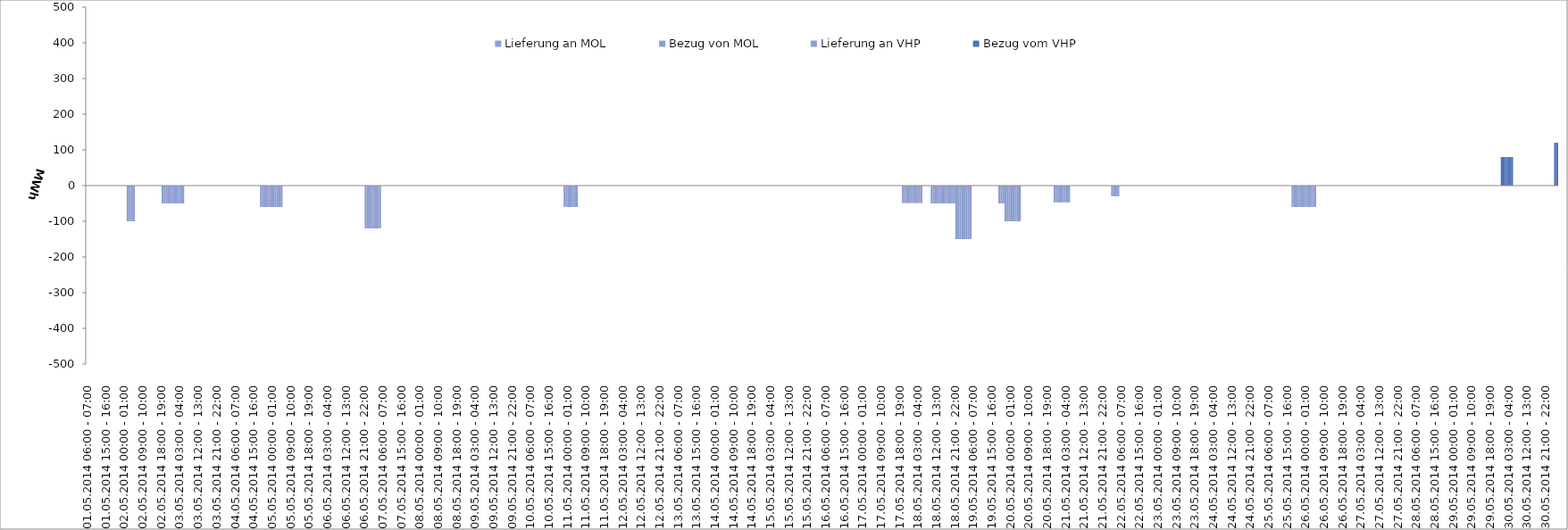
| Category | Bezug vom VHP | Lieferung an VHP | Bezug von MOL | Lieferung an MOL |
|---|---|---|---|---|
| 01.05.2014 06:00 - 07:00 | 0 | 0 | 0 | 0 |
| 01.05.2014 07:00 - 08:00 | 0 | 0 | 0 | 0 |
| 01.05.2014 08:00 - 09:00 | 0 | 0 | 0 | 0 |
| 01.05.2014 09:00 - 10:00 | 0 | 0 | 0 | 0 |
| 01.05.2014 10:00 - 11:00 | 0 | 0 | 0 | 0 |
| 01.05.2014 11:00 - 12:00 | 0 | 0 | 0 | 0 |
| 01.05.2014 12:00 - 13:00 | 0 | 0 | 0 | 0 |
| 01.05.2014 13:00 - 14:00 | 0 | 0 | 0 | 0 |
| 01.05.2014 14:00 - 15:00 | 0 | 0 | 0 | 0 |
| 01.05.2014 15:00 - 16:00 | 0 | 0 | 0 | 0 |
| 01.05.2014 16:00 - 17:00 | 0 | 0 | 0 | 0 |
| 01.05.2014 17:00 - 18:00 | 0 | 0 | 0 | 0 |
| 01.05.2014 18:00 - 19:00 | 0 | 0 | 0 | 0 |
| 01.05.2014 19:00 - 20:00 | 0 | 0 | 0 | 0 |
| 01.05.2014 20:00 - 21:00 | 0 | 0 | 0 | 0 |
| 01.05.2014 21:00 - 22:00 | 0 | 0 | 0 | 0 |
| 01.05.2014 22:00 - 23:00 | 0 | 0 | 0 | 0 |
| 01.05.2014 23:00 - 24:00 | 0 | 0 | 0 | 0 |
| 02.05.2014 00:00 - 01:00 | 0 | 0 | 0 | 0 |
| 02.05.2014 01:00 - 02:00 | 0 | 0 | 0 | 0 |
| 02.05.2014 02:00 - 03:00 | 0 | -100 | 0 | 0 |
| 02.05.2014 03:00 - 04:00 | 0 | -100 | 0 | 0 |
| 02.05.2014 04:00 - 05:00 | 0 | -100 | 0 | 0 |
| 02.05.2014 05:00 - 06:00 | 0 | -100 | 0 | 0 |
| 02.05.2014 06:00 - 07:00 | 0 | 0 | 0 | 0 |
| 02.05.2014 07:00 - 08:00 | 0 | 0 | 0 | 0 |
| 02.05.2014 08:00 - 09:00 | 0 | 0 | 0 | 0 |
| 02.05.2014 09:00 - 10:00 | 0 | 0 | 0 | 0 |
| 02.05.2014 10:00 - 11:00 | 0 | 0 | 0 | 0 |
| 02.05.2014 11:00 - 12:00 | 0 | 0 | 0 | 0 |
| 02.05.2014 12:00 - 13:00 | 0 | 0 | 0 | 0 |
| 02.05.2014 13:00 - 14:00 | 0 | 0 | 0 | 0 |
| 02.05.2014 14:00 - 15:00 | 0 | 0 | 0 | 0 |
| 02.05.2014 15:00 - 16:00 | 0 | 0 | 0 | 0 |
| 02.05.2014 16:00 - 17:00 | 0 | 0 | 0 | 0 |
| 02.05.2014 17:00 - 18:00 | 0 | 0 | 0 | 0 |
| 02.05.2014 18:00 - 19:00 | 0 | 0 | 0 | 0 |
| 02.05.2014 19:00 - 20:00 | 0 | -50 | 0 | 0 |
| 02.05.2014 20:00 - 21:00 | 0 | -50 | 0 | 0 |
| 02.05.2014 21:00 - 22:00 | 0 | -50 | 0 | 0 |
| 02.05.2014 22:00 - 23:00 | 0 | -50 | 0 | 0 |
| 02.05.2014 23:00 - 24:00 | 0 | -50 | 0 | 0 |
| 03.05.2014 00:00 - 01:00 | 0 | -50 | 0 | 0 |
| 03.05.2014 01:00 - 02:00 | 0 | -50 | 0 | 0 |
| 03.05.2014 02:00 - 03:00 | 0 | -50 | 0 | 0 |
| 03.05.2014 03:00 - 04:00 | 0 | -50 | 0 | 0 |
| 03.05.2014 04:00 - 05:00 | 0 | -50 | 0 | 0 |
| 03.05.2014 05:00 - 06:00 | 0 | -50 | 0 | 0 |
| 03.05.2014 06:00 - 07:00 | 0 | 0 | 0 | 0 |
| 03.05.2014 07:00 - 08:00 | 0 | 0 | 0 | 0 |
| 03.05.2014 08:00 - 09:00 | 0 | 0 | 0 | 0 |
| 03.05.2014 09:00 - 10:00 | 0 | 0 | 0 | 0 |
| 03.05.2014 10:00 - 11:00 | 0 | 0 | 0 | 0 |
| 03.05.2014 11:00 - 12:00 | 0 | 0 | 0 | 0 |
| 03.05.2014 12:00 - 13:00 | 0 | 0 | 0 | 0 |
| 03.05.2014 13:00 - 14:00 | 0 | 0 | 0 | 0 |
| 03.05.2014 14:00 - 15:00 | 0 | 0 | 0 | 0 |
| 03.05.2014 15:00 - 16:00 | 0 | 0 | 0 | 0 |
| 03.05.2014 16:00 - 17:00 | 0 | 0 | 0 | 0 |
| 03.05.2014 17:00 - 18:00 | 0 | 0 | 0 | 0 |
| 03.05.2014 18:00 - 19:00 | 0 | 0 | 0 | 0 |
| 03.05.2014 19:00 - 20:00 | 0 | 0 | 0 | 0 |
| 03.05.2014 20:00 - 21:00 | 0 | 0 | 0 | 0 |
| 03.05.2014 21:00 - 22:00 | 0 | 0 | 0 | 0 |
| 03.05.2014 22:00 - 23:00 | 0 | 0 | 0 | 0 |
| 03.05.2014 23:00 - 24:00 | 0 | 0 | 0 | 0 |
| 04.05.2014 00:00 - 01:00 | 0 | 0 | 0 | 0 |
| 04.05.2014 01:00 - 02:00 | 0 | 0 | 0 | 0 |
| 04.05.2014 02:00 - 03:00 | 0 | 0 | 0 | 0 |
| 04.05.2014 03:00 - 04:00 | 0 | 0 | 0 | 0 |
| 04.05.2014 04:00 - 05:00 | 0 | 0 | 0 | 0 |
| 04.05.2014 05:00 - 06:00 | 0 | 0 | 0 | 0 |
| 04.05.2014 06:00 - 07:00 | 0 | 0 | 0 | 0 |
| 04.05.2014 07:00 - 08:00 | 0 | 0 | 0 | 0 |
| 04.05.2014 08:00 - 09:00 | 0 | 0 | 0 | 0 |
| 04.05.2014 09:00 - 10:00 | 0 | 0 | 0 | 0 |
| 04.05.2014 10:00 - 11:00 | 0 | 0 | 0 | 0 |
| 04.05.2014 11:00 - 12:00 | 0 | 0 | 0 | 0 |
| 04.05.2014 12:00 - 13:00 | 0 | 0 | 0 | 0 |
| 04.05.2014 13:00 - 14:00 | 0 | 0 | 0 | 0 |
| 04.05.2014 14:00 - 15:00 | 0 | 0 | 0 | 0 |
| 04.05.2014 15:00 - 16:00 | 0 | 0 | 0 | 0 |
| 04.05.2014 16:00 - 17:00 | 0 | 0 | 0 | 0 |
| 04.05.2014 17:00 - 18:00 | 0 | 0 | 0 | 0 |
| 04.05.2014 18:00 - 19:00 | 0 | 0 | 0 | 0 |
| 04.05.2014 19:00 - 20:00 | 0 | -60 | 0 | 0 |
| 04.05.2014 20:00 - 21:00 | 0 | -60 | 0 | 0 |
| 04.05.2014 21:00 - 22:00 | 0 | -60 | 0 | 0 |
| 04.05.2014 22:00 - 23:00 | 0 | -60 | 0 | 0 |
| 04.05.2014 23:00 - 24:00 | 0 | -60 | 0 | 0 |
| 05.05.2014 00:00 - 01:00 | 0 | -60 | 0 | 0 |
| 05.05.2014 01:00 - 02:00 | 0 | -60 | 0 | 0 |
| 05.05.2014 02:00 - 03:00 | 0 | -60 | 0 | 0 |
| 05.05.2014 03:00 - 04:00 | 0 | -60 | 0 | 0 |
| 05.05.2014 04:00 - 05:00 | 0 | -60 | 0 | 0 |
| 05.05.2014 05:00 - 06:00 | 0 | -60 | 0 | 0 |
| 05.05.2014 06:00 - 07:00 | 0 | 0 | 0 | 0 |
| 05.05.2014 07:00 - 08:00 | 0 | 0 | 0 | 0 |
| 05.05.2014 08:00 - 09:00 | 0 | 0 | 0 | 0 |
| 05.05.2014 09:00 - 10:00 | 0 | 0 | 0 | 0 |
| 05.05.2014 10:00 - 11:00 | 0 | 0 | 0 | 0 |
| 05.05.2014 11:00 - 12:00 | 0 | 0 | 0 | 0 |
| 05.05.2014 12:00 - 13:00 | 0 | 0 | 0 | 0 |
| 05.05.2014 13:00 - 14:00 | 0 | 0 | 0 | 0 |
| 05.05.2014 14:00 - 15:00 | 0 | 0 | 0 | 0 |
| 05.05.2014 15:00 - 16:00 | 0 | 0 | 0 | 0 |
| 05.05.2014 16:00 - 17:00 | 0 | 0 | 0 | 0 |
| 05.05.2014 17:00 - 18:00 | 0 | 0 | 0 | 0 |
| 05.05.2014 18:00 - 19:00 | 0 | 0 | 0 | 0 |
| 05.05.2014 19:00 - 20:00 | 0 | 0 | 0 | 0 |
| 05.05.2014 20:00 - 21:00 | 0 | 0 | 0 | 0 |
| 05.05.2014 21:00 - 22:00 | 0 | 0 | 0 | 0 |
| 05.05.2014 22:00 - 23:00 | 0 | 0 | 0 | 0 |
| 05.05.2014 23:00 - 24:00 | 0 | 0 | 0 | 0 |
| 06.05.2014 00:00 - 01:00 | 0 | 0 | 0 | 0 |
| 06.05.2014 01:00 - 02:00 | 0 | 0 | 0 | 0 |
| 06.05.2014 02:00 - 03:00 | 0 | 0 | 0 | 0 |
| 06.05.2014 03:00 - 04:00 | 0 | 0 | 0 | 0 |
| 06.05.2014 04:00 - 05:00 | 0 | 0 | 0 | 0 |
| 06.05.2014 05:00 - 06:00 | 0 | 0 | 0 | 0 |
| 06.05.2014 06:00 - 07:00 | 0 | 0 | 0 | 0 |
| 06.05.2014 07:00 - 08:00 | 0 | 0 | 0 | 0 |
| 06.05.2014 08:00 - 09:00 | 0 | 0 | 0 | 0 |
| 06.05.2014 09:00 - 10:00 | 0 | 0 | 0 | 0 |
| 06.05.2014 10:00 - 11:00 | 0 | 0 | 0 | 0 |
| 06.05.2014 11:00 - 12:00 | 0 | 0 | 0 | 0 |
| 06.05.2014 12:00 - 13:00 | 0 | 0 | 0 | 0 |
| 06.05.2014 13:00 - 14:00 | 0 | 0 | 0 | 0 |
| 06.05.2014 14:00 - 15:00 | 0 | 0 | 0 | 0 |
| 06.05.2014 15:00 - 16:00 | 0 | 0 | 0 | 0 |
| 06.05.2014 16:00 - 17:00 | 0 | 0 | 0 | 0 |
| 06.05.2014 17:00 - 18:00 | 0 | 0 | 0 | 0 |
| 06.05.2014 18:00 - 19:00 | 0 | 0 | 0 | 0 |
| 06.05.2014 19:00 - 20:00 | 0 | 0 | 0 | 0 |
| 06.05.2014 20:00 - 21:00 | 0 | 0 | 0 | 0 |
| 06.05.2014 21:00 - 22:00 | 0 | 0 | 0 | 0 |
| 06.05.2014 22:00 - 23:00 | 0 | -120 | 0 | 0 |
| 06.05.2014 23:00 - 24:00 | 0 | -120 | 0 | 0 |
| 07.05.2014 00:00 - 01:00 | 0 | -120 | 0 | 0 |
| 07.05.2014 01:00 - 02:00 | 0 | -120 | 0 | 0 |
| 07.05.2014 02:00 - 03:00 | 0 | -120 | 0 | 0 |
| 07.05.2014 03:00 - 04:00 | 0 | -120 | 0 | 0 |
| 07.05.2014 04:00 - 05:00 | 0 | -120 | 0 | 0 |
| 07.05.2014 05:00 - 06:00 | 0 | -120 | 0 | 0 |
| 07.05.2014 06:00 - 07:00 | 0 | 0 | 0 | 0 |
| 07.05.2014 07:00 - 08:00 | 0 | 0 | 0 | 0 |
| 07.05.2014 08:00 - 09:00 | 0 | 0 | 0 | 0 |
| 07.05.2014 09:00 - 10:00 | 0 | 0 | 0 | 0 |
| 07.05.2014 10:00 - 11:00 | 0 | 0 | 0 | 0 |
| 07.05.2014 11:00 - 12:00 | 0 | 0 | 0 | 0 |
| 07.05.2014 12:00 - 13:00 | 0 | 0 | 0 | 0 |
| 07.05.2014 13:00 - 14:00 | 0 | 0 | 0 | 0 |
| 07.05.2014 14:00 - 15:00 | 0 | 0 | 0 | 0 |
| 07.05.2014 15:00 - 16:00 | 0 | 0 | 0 | 0 |
| 07.05.2014 16:00 - 17:00 | 0 | 0 | 0 | 0 |
| 07.05.2014 17:00 - 18:00 | 0 | 0 | 0 | 0 |
| 07.05.2014 18:00 - 19:00 | 0 | 0 | 0 | 0 |
| 07.05.2014 19:00 - 20:00 | 0 | 0 | 0 | 0 |
| 07.05.2014 20:00 - 21:00 | 0 | 0 | 0 | 0 |
| 07.05.2014 21:00 - 22:00 | 0 | 0 | 0 | 0 |
| 07.05.2014 22:00 - 23:00 | 0 | 0 | 0 | 0 |
| 07.05.2014 23:00 - 24:00 | 0 | 0 | 0 | 0 |
| 08.05.2014 00:00 - 01:00 | 0 | 0 | 0 | 0 |
| 08.05.2014 01:00 - 02:00 | 0 | 0 | 0 | 0 |
| 08.05.2014 02:00 - 03:00 | 0 | 0 | 0 | 0 |
| 08.05.2014 03:00 - 04:00 | 0 | 0 | 0 | 0 |
| 08.05.2014 04:00 - 05:00 | 0 | 0 | 0 | 0 |
| 08.05.2014 05:00 - 06:00 | 0 | 0 | 0 | 0 |
| 08.05.2014 06:00 - 07:00 | 0 | 0 | 0 | 0 |
| 08.05.2014 07:00 - 08:00 | 0 | 0 | 0 | 0 |
| 08.05.2014 08:00 - 09:00 | 0 | 0 | 0 | 0 |
| 08.05.2014 09:00 - 10:00 | 0 | 0 | 0 | 0 |
| 08.05.2014 10:00 - 11:00 | 0 | 0 | 0 | 0 |
| 08.05.2014 11:00 - 12:00 | 0 | 0 | 0 | 0 |
| 08.05.2014 12:00 - 13:00 | 0 | 0 | 0 | 0 |
| 08.05.2014 13:00 - 14:00 | 0 | 0 | 0 | 0 |
| 08.05.2014 14:00 - 15:00 | 0 | 0 | 0 | 0 |
| 08.05.2014 15:00 - 16:00 | 0 | 0 | 0 | 0 |
| 08.05.2014 16:00 - 17:00 | 0 | 0 | 0 | 0 |
| 08.05.2014 17:00 - 18:00 | 0 | 0 | 0 | 0 |
| 08.05.2014 18:00 - 19:00 | 0 | 0 | 0 | 0 |
| 08.05.2014 19:00 - 20:00 | 0 | 0 | 0 | 0 |
| 08.05.2014 20:00 - 21:00 | 0 | 0 | 0 | 0 |
| 08.05.2014 21:00 - 22:00 | 0 | 0 | 0 | 0 |
| 08.05.2014 22:00 - 23:00 | 0 | 0 | 0 | 0 |
| 08.05.2014 23:00 - 24:00 | 0 | 0 | 0 | 0 |
| 09.05.2014 00:00 - 01:00 | 0 | 0 | 0 | 0 |
| 09.05.2014 01:00 - 02:00 | 0 | 0 | 0 | 0 |
| 09.05.2014 02:00 - 03:00 | 0 | 0 | 0 | 0 |
| 09.05.2014 03:00 - 04:00 | 0 | 0 | 0 | 0 |
| 09.05.2014 04:00 - 05:00 | 0 | 0 | 0 | 0 |
| 09.05.2014 05:00 - 06:00 | 0 | 0 | 0 | 0 |
| 09.05.2014 06:00 - 07:00 | 0 | 0 | 0 | 0 |
| 09.05.2014 07:00 - 08:00 | 0 | 0 | 0 | 0 |
| 09.05.2014 08:00 - 09:00 | 0 | 0 | 0 | 0 |
| 09.05.2014 09:00 - 10:00 | 0 | 0 | 0 | 0 |
| 09.05.2014 10:00 - 11:00 | 0 | 0 | 0 | 0 |
| 09.05.2014 11:00 - 12:00 | 0 | 0 | 0 | 0 |
| 09.05.2014 12:00 - 13:00 | 0 | 0 | 0 | 0 |
| 09.05.2014 13:00 - 14:00 | 0 | 0 | 0 | 0 |
| 09.05.2014 14:00 - 15:00 | 0 | 0 | 0 | 0 |
| 09.05.2014 15:00 - 16:00 | 0 | 0 | 0 | 0 |
| 09.05.2014 16:00 - 17:00 | 0 | 0 | 0 | 0 |
| 09.05.2014 17:00 - 18:00 | 0 | 0 | 0 | 0 |
| 09.05.2014 18:00 - 19:00 | 0 | 0 | 0 | 0 |
| 09.05.2014 19:00 - 20:00 | 0 | 0 | 0 | 0 |
| 09.05.2014 20:00 - 21:00 | 0 | 0 | 0 | 0 |
| 09.05.2014 21:00 - 22:00 | 0 | 0 | 0 | 0 |
| 09.05.2014 22:00 - 23:00 | 0 | 0 | 0 | 0 |
| 09.05.2014 23:00 - 24:00 | 0 | 0 | 0 | 0 |
| 10.05.2014 00:00 - 01:00 | 0 | 0 | 0 | 0 |
| 10.05.2014 01:00 - 02:00 | 0 | 0 | 0 | 0 |
| 10.05.2014 02:00 - 03:00 | 0 | 0 | 0 | 0 |
| 10.05.2014 03:00 - 04:00 | 0 | 0 | 0 | 0 |
| 10.05.2014 04:00 - 05:00 | 0 | 0 | 0 | 0 |
| 10.05.2014 05:00 - 06:00 | 0 | 0 | 0 | 0 |
| 10.05.2014 06:00 - 07:00 | 0 | 0 | 0 | 0 |
| 10.05.2014 07:00 - 08:00 | 0 | 0 | 0 | 0 |
| 10.05.2014 08:00 - 09:00 | 0 | 0 | 0 | 0 |
| 10.05.2014 09:00 - 10:00 | 0 | 0 | 0 | 0 |
| 10.05.2014 10:00 - 11:00 | 0 | 0 | 0 | 0 |
| 10.05.2014 11:00 - 12:00 | 0 | 0 | 0 | 0 |
| 10.05.2014 12:00 - 13:00 | 0 | 0 | 0 | 0 |
| 10.05.2014 13:00 - 14:00 | 0 | 0 | 0 | 0 |
| 10.05.2014 14:00 - 15:00 | 0 | 0 | 0 | 0 |
| 10.05.2014 15:00 - 16:00 | 0 | 0 | 0 | 0 |
| 10.05.2014 16:00 - 17:00 | 0 | 0 | 0 | 0 |
| 10.05.2014 17:00 - 18:00 | 0 | 0 | 0 | 0 |
| 10.05.2014 18:00 - 19:00 | 0 | 0 | 0 | 0 |
| 10.05.2014 19:00 - 20:00 | 0 | 0 | 0 | 0 |
| 10.05.2014 20:00 - 21:00 | 0 | 0 | 0 | 0 |
| 10.05.2014 21:00 - 22:00 | 0 | 0 | 0 | 0 |
| 10.05.2014 22:00 - 23:00 | 0 | 0 | 0 | 0 |
| 10.05.2014 23:00 - 24:00 | 0 | -60 | 0 | 0 |
| 11.05.2014 00:00 - 01:00 | 0 | -60 | 0 | 0 |
| 11.05.2014 01:00 - 02:00 | 0 | -60 | 0 | 0 |
| 11.05.2014 02:00 - 03:00 | 0 | -60 | 0 | 0 |
| 11.05.2014 03:00 - 04:00 | 0 | -60 | 0 | 0 |
| 11.05.2014 04:00 - 05:00 | 0 | -60 | 0 | 0 |
| 11.05.2014 05:00 - 06:00 | 0 | -60 | 0 | 0 |
| 11.05.2014 06:00 - 07:00 | 0 | 0 | 0 | 0 |
| 11.05.2014 07:00 - 08:00 | 0 | 0 | 0 | 0 |
| 11.05.2014 08:00 - 09:00 | 0 | 0 | 0 | 0 |
| 11.05.2014 09:00 - 10:00 | 0 | 0 | 0 | 0 |
| 11.05.2014 10:00 - 11:00 | 0 | 0 | 0 | 0 |
| 11.05.2014 11:00 - 12:00 | 0 | 0 | 0 | 0 |
| 11.05.2014 12:00 - 13:00 | 0 | 0 | 0 | 0 |
| 11.05.2014 13:00 - 14:00 | 0 | 0 | 0 | 0 |
| 11.05.2014 14:00 - 15:00 | 0 | 0 | 0 | 0 |
| 11.05.2014 15:00 - 16:00 | 0 | 0 | 0 | 0 |
| 11.05.2014 16:00 - 17:00 | 0 | 0 | 0 | 0 |
| 11.05.2014 17:00 - 18:00 | 0 | 0 | 0 | 0 |
| 11.05.2014 18:00 - 19:00 | 0 | 0 | 0 | 0 |
| 11.05.2014 19:00 - 20:00 | 0 | 0 | 0 | 0 |
| 11.05.2014 20:00 - 21:00 | 0 | 0 | 0 | 0 |
| 11.05.2014 21:00 - 22:00 | 0 | 0 | 0 | 0 |
| 11.05.2014 22:00 - 23:00 | 0 | 0 | 0 | 0 |
| 11.05.2014 23:00 - 24:00 | 0 | 0 | 0 | 0 |
| 12.05.2014 00:00 - 01:00 | 0 | 0 | 0 | 0 |
| 12.05.2014 01:00 - 02:00 | 0 | 0 | 0 | 0 |
| 12.05.2014 02:00 - 03:00 | 0 | 0 | 0 | 0 |
| 12.05.2014 03:00 - 04:00 | 0 | 0 | 0 | 0 |
| 12.05.2014 04:00 - 05:00 | 0 | 0 | 0 | 0 |
| 12.05.2014 05:00 - 06:00 | 0 | 0 | 0 | 0 |
| 12.05.2014 06:00 - 07:00 | 0 | 0 | 0 | 0 |
| 12.05.2014 07:00 - 08:00 | 0 | 0 | 0 | 0 |
| 12.05.2014 08:00 - 09:00 | 0 | 0 | 0 | 0 |
| 12.05.2014 09:00 - 10:00 | 0 | 0 | 0 | 0 |
| 12.05.2014 10:00 - 11:00 | 0 | 0 | 0 | 0 |
| 12.05.2014 11:00 - 12:00 | 0 | 0 | 0 | 0 |
| 12.05.2014 12:00 - 13:00 | 0 | 0 | 0 | 0 |
| 12.05.2014 13:00 - 14:00 | 0 | 0 | 0 | 0 |
| 12.05.2014 14:00 - 15:00 | 0 | 0 | 0 | 0 |
| 12.05.2014 15:00 - 16:00 | 0 | 0 | 0 | 0 |
| 12.05.2014 16:00 - 17:00 | 0 | 0 | 0 | 0 |
| 12.05.2014 17:00 - 18:00 | 0 | 0 | 0 | 0 |
| 12.05.2014 18:00 - 19:00 | 0 | 0 | 0 | 0 |
| 12.05.2014 19:00 - 20:00 | 0 | 0 | 0 | 0 |
| 12.05.2014 20:00 - 21:00 | 0 | 0 | 0 | 0 |
| 12.05.2014 21:00 - 22:00 | 0 | 0 | 0 | 0 |
| 12.05.2014 22:00 - 23:00 | 0 | 0 | 0 | 0 |
| 12.05.2014 23:00 - 24:00 | 0 | 0 | 0 | 0 |
| 13.05.2014 00:00 - 01:00 | 0 | 0 | 0 | 0 |
| 13.05.2014 01:00 - 02:00 | 0 | 0 | 0 | 0 |
| 13.05.2014 02:00 - 03:00 | 0 | 0 | 0 | 0 |
| 13.05.2014 03:00 - 04:00 | 0 | 0 | 0 | 0 |
| 13.05.2014 04:00 - 05:00 | 0 | 0 | 0 | 0 |
| 13.05.2014 05:00 - 06:00 | 0 | 0 | 0 | 0 |
| 13.05.2014 06:00 - 07:00 | 0 | 0 | 0 | 0 |
| 13.05.2014 07:00 - 08:00 | 0 | 0 | 0 | 0 |
| 13.05.2014 08:00 - 09:00 | 0 | 0 | 0 | 0 |
| 13.05.2014 09:00 - 10:00 | 0 | 0 | 0 | 0 |
| 13.05.2014 10:00 - 11:00 | 0 | 0 | 0 | 0 |
| 13.05.2014 11:00 - 12:00 | 0 | 0 | 0 | 0 |
| 13.05.2014 12:00 - 13:00 | 0 | 0 | 0 | 0 |
| 13.05.2014 13:00 - 14:00 | 0 | 0 | 0 | 0 |
| 13.05.2014 14:00 - 15:00 | 0 | 0 | 0 | 0 |
| 13.05.2014 15:00 - 16:00 | 0 | 0 | 0 | 0 |
| 13.05.2014 16:00 - 17:00 | 0 | 0 | 0 | 0 |
| 13.05.2014 17:00 - 18:00 | 0 | 0 | 0 | 0 |
| 13.05.2014 18:00 - 19:00 | 0 | 0 | 0 | 0 |
| 13.05.2014 19:00 - 20:00 | 0 | 0 | 0 | 0 |
| 13.05.2014 20:00 - 21:00 | 0 | 0 | 0 | 0 |
| 13.05.2014 21:00 - 22:00 | 0 | 0 | 0 | 0 |
| 13.05.2014 22:00 - 23:00 | 0 | 0 | 0 | 0 |
| 13.05.2014 23:00 - 24:00 | 0 | 0 | 0 | 0 |
| 14.05.2014 00:00 - 01:00 | 0 | 0 | 0 | 0 |
| 14.05.2014 01:00 - 02:00 | 0 | 0 | 0 | 0 |
| 14.05.2014 02:00 - 03:00 | 0 | 0 | 0 | 0 |
| 14.05.2014 03:00 - 04:00 | 0 | 0 | 0 | 0 |
| 14.05.2014 04:00 - 05:00 | 0 | 0 | 0 | 0 |
| 14.05.2014 05:00 - 06:00 | 0 | 0 | 0 | 0 |
| 14.05.2014 06:00 - 07:00 | 0 | 0 | 0 | 0 |
| 14.05.2014 07:00 - 08:00 | 0 | 0 | 0 | 0 |
| 14.05.2014 08:00 - 09:00 | 0 | 0 | 0 | 0 |
| 14.05.2014 09:00 - 10:00 | 0 | 0 | 0 | 0 |
| 14.05.2014 10:00 - 11:00 | 0 | 0 | 0 | 0 |
| 14.05.2014 11:00 - 12:00 | 0 | 0 | 0 | 0 |
| 14.05.2014 12:00 - 13:00 | 0 | 0 | 0 | 0 |
| 14.05.2014 13:00 - 14:00 | 0 | 0 | 0 | 0 |
| 14.05.2014 14:00 - 15:00 | 0 | 0 | 0 | 0 |
| 14.05.2014 15:00 - 16:00 | 0 | 0 | 0 | 0 |
| 14.05.2014 16:00 - 17:00 | 0 | 0 | 0 | 0 |
| 14.05.2014 17:00 - 18:00 | 0 | 0 | 0 | 0 |
| 14.05.2014 18:00 - 19:00 | 0 | 0 | 0 | 0 |
| 14.05.2014 19:00 - 20:00 | 0 | 0 | 0 | 0 |
| 14.05.2014 20:00 - 21:00 | 0 | 0 | 0 | 0 |
| 14.05.2014 21:00 - 22:00 | 0 | 0 | 0 | 0 |
| 14.05.2014 22:00 - 23:00 | 0 | 0 | 0 | 0 |
| 14.05.2014 23:00 - 24:00 | 0 | 0 | 0 | 0 |
| 15.05.2014 00:00 - 01:00 | 0 | 0 | 0 | 0 |
| 15.05.2014 01:00 - 02:00 | 0 | 0 | 0 | 0 |
| 15.05.2014 02:00 - 03:00 | 0 | 0 | 0 | 0 |
| 15.05.2014 03:00 - 04:00 | 0 | 0 | 0 | 0 |
| 15.05.2014 04:00 - 05:00 | 0 | 0 | 0 | 0 |
| 15.05.2014 05:00 - 06:00 | 0 | 0 | 0 | 0 |
| 15.05.2014 06:00 - 07:00 | 0 | 0 | 0 | 0 |
| 15.05.2014 07:00 - 08:00 | 0 | 0 | 0 | 0 |
| 15.05.2014 08:00 - 09:00 | 0 | 0 | 0 | 0 |
| 15.05.2014 09:00 - 10:00 | 0 | 0 | 0 | 0 |
| 15.05.2014 10:00 - 11:00 | 0 | 0 | 0 | 0 |
| 15.05.2014 11:00 - 12:00 | 0 | 0 | 0 | 0 |
| 15.05.2014 12:00 - 13:00 | 0 | 0 | 0 | 0 |
| 15.05.2014 13:00 - 14:00 | 0 | 0 | 0 | 0 |
| 15.05.2014 14:00 - 15:00 | 0 | 0 | 0 | 0 |
| 15.05.2014 15:00 - 16:00 | 0 | 0 | 0 | 0 |
| 15.05.2014 16:00 - 17:00 | 0 | 0 | 0 | 0 |
| 15.05.2014 17:00 - 18:00 | 0 | 0 | 0 | 0 |
| 15.05.2014 18:00 - 19:00 | 0 | 0 | 0 | 0 |
| 15.05.2014 19:00 - 20:00 | 0 | 0 | 0 | 0 |
| 15.05.2014 20:00 - 21:00 | 0 | 0 | 0 | 0 |
| 15.05.2014 21:00 - 22:00 | 0 | 0 | 0 | 0 |
| 15.05.2014 22:00 - 23:00 | 0 | 0 | 0 | 0 |
| 15.05.2014 23:00 - 24:00 | 0 | 0 | 0 | 0 |
| 16.05.2014 00:00 - 01:00 | 0 | 0 | 0 | 0 |
| 16.05.2014 01:00 - 02:00 | 0 | 0 | 0 | 0 |
| 16.05.2014 02:00 - 03:00 | 0 | 0 | 0 | 0 |
| 16.05.2014 03:00 - 04:00 | 0 | 0 | 0 | 0 |
| 16.05.2014 04:00 - 05:00 | 0 | 0 | 0 | 0 |
| 16.05.2014 05:00 - 06:00 | 0 | 0 | 0 | 0 |
| 16.05.2014 06:00 - 07:00 | 0 | 0 | 0 | 0 |
| 16.05.2014 07:00 - 08:00 | 0 | 0 | 0 | 0 |
| 16.05.2014 08:00 - 09:00 | 0 | 0 | 0 | 0 |
| 16.05.2014 09:00 - 10:00 | 0 | 0 | 0 | 0 |
| 16.05.2014 10:00 - 11:00 | 0 | 0 | 0 | 0 |
| 16.05.2014 11:00 - 12:00 | 0 | 0 | 0 | 0 |
| 16.05.2014 12:00 - 13:00 | 0 | 0 | 0 | 0 |
| 16.05.2014 13:00 - 14:00 | 0 | 0 | 0 | 0 |
| 16.05.2014 14:00 - 15:00 | 0 | 0 | 0 | 0 |
| 16.05.2014 15:00 - 16:00 | 0 | 0 | 0 | 0 |
| 16.05.2014 16:00 - 17:00 | 0 | 0 | 0 | 0 |
| 16.05.2014 17:00 - 18:00 | 0 | 0 | 0 | 0 |
| 16.05.2014 18:00 - 19:00 | 0 | 0 | 0 | 0 |
| 16.05.2014 19:00 - 20:00 | 0 | 0 | 0 | 0 |
| 16.05.2014 20:00 - 21:00 | 0 | 0 | 0 | 0 |
| 16.05.2014 21:00 - 22:00 | 0 | 0 | 0 | 0 |
| 16.05.2014 22:00 - 23:00 | 0 | 0 | 0 | 0 |
| 16.05.2014 23:00 - 24:00 | 0 | 0 | 0 | 0 |
| 17.05.2014 00:00 - 01:00 | 0 | 0 | 0 | 0 |
| 17.05.2014 01:00 - 02:00 | 0 | 0 | 0 | 0 |
| 17.05.2014 02:00 - 03:00 | 0 | 0 | 0 | 0 |
| 17.05.2014 03:00 - 04:00 | 0 | 0 | 0 | 0 |
| 17.05.2014 04:00 - 05:00 | 0 | 0 | 0 | 0 |
| 17.05.2014 05:00 - 06:00 | 0 | 0 | 0 | 0 |
| 17.05.2014 06:00 - 07:00 | 0 | 0 | 0 | 0 |
| 17.05.2014 07:00 - 08:00 | 0 | 0 | 0 | 0 |
| 17.05.2014 08:00 - 09:00 | 0 | 0 | 0 | 0 |
| 17.05.2014 09:00 - 10:00 | 0 | 0 | 0 | 0 |
| 17.05.2014 10:00 - 11:00 | 0 | 0 | 0 | 0 |
| 17.05.2014 11:00 - 12:00 | 0 | 0 | 0 | 0 |
| 17.05.2014 12:00 - 13:00 | 0 | 0 | 0 | 0 |
| 17.05.2014 13:00 - 14:00 | 0 | 0 | 0 | 0 |
| 17.05.2014 14:00 - 15:00 | 0 | 0 | 0 | 0 |
| 17.05.2014 15:00 - 16:00 | 0 | 0 | 0 | 0 |
| 17.05.2014 16:00 - 17:00 | 0 | 0 | 0 | 0 |
| 17.05.2014 17:00 - 18:00 | 0 | 0 | 0 | 0 |
| 17.05.2014 18:00 - 19:00 | 0 | 0 | 0 | 0 |
| 17.05.2014 19:00 - 20:00 | 0 | 0 | 0 | 0 |
| 17.05.2014 20:00 - 21:00 | 0 | -49 | 0 | 0 |
| 17.05.2014 21:00 - 22:00 | 0 | -49 | 0 | 0 |
| 17.05.2014 22:00 - 23:00 | 0 | -49 | 0 | 0 |
| 17.05.2014 23:00 - 24:00 | 0 | -49 | 0 | 0 |
| 18.05.2014 00:00 - 01:00 | 0 | -49 | 0 | 0 |
| 18.05.2014 01:00 - 02:00 | 0 | -49 | 0 | 0 |
| 18.05.2014 02:00 - 03:00 | 0 | -49 | 0 | 0 |
| 18.05.2014 03:00 - 04:00 | 0 | -49 | 0 | 0 |
| 18.05.2014 04:00 - 05:00 | 0 | -49 | 0 | 0 |
| 18.05.2014 05:00 - 06:00 | 0 | -49 | 0 | 0 |
| 18.05.2014 06:00 - 07:00 | 0 | 0 | 0 | 0 |
| 18.05.2014 07:00 - 08:00 | 0 | 0 | 0 | 0 |
| 18.05.2014 08:00 - 09:00 | 0 | 0 | 0 | 0 |
| 18.05.2014 09:00 - 10:00 | 0 | 0 | 0 | 0 |
| 18.05.2014 10:00 - 11:00 | 0 | -50 | 0 | 0 |
| 18.05.2014 11:00 - 12:00 | 0 | -50 | 0 | 0 |
| 18.05.2014 12:00 - 13:00 | 0 | -50 | 0 | 0 |
| 18.05.2014 13:00 - 14:00 | 0 | -50 | 0 | 0 |
| 18.05.2014 14:00 - 15:00 | 0 | -50 | 0 | 0 |
| 18.05.2014 15:00 - 16:00 | 0 | -50 | 0 | 0 |
| 18.05.2014 16:00 - 17:00 | 0 | -50 | 0 | 0 |
| 18.05.2014 17:00 - 18:00 | 0 | -50 | 0 | 0 |
| 18.05.2014 18:00 - 19:00 | 0 | -50 | 0 | 0 |
| 18.05.2014 19:00 - 20:00 | 0 | -50 | 0 | 0 |
| 18.05.2014 20:00 - 21:00 | 0 | -50 | 0 | 0 |
| 18.05.2014 21:00 - 22:00 | 0 | -50 | 0 | 0 |
| 18.05.2014 22:00 - 23:00 | 0 | -150 | 0 | 0 |
| 18.05.2014 23:00 - 24:00 | 0 | -150 | 0 | 0 |
| 19.05.2014 00:00 - 01:00 | 0 | -150 | 0 | 0 |
| 19.05.2014 01:00 - 02:00 | 0 | -150 | 0 | 0 |
| 19.05.2014 02:00 - 03:00 | 0 | -150 | 0 | 0 |
| 19.05.2014 03:00 - 04:00 | 0 | -150 | 0 | 0 |
| 19.05.2014 04:00 - 05:00 | 0 | -150 | 0 | 0 |
| 19.05.2014 05:00 - 06:00 | 0 | -150 | 0 | 0 |
| 19.05.2014 06:00 - 07:00 | 0 | 0 | 0 | 0 |
| 19.05.2014 07:00 - 08:00 | 0 | 0 | 0 | 0 |
| 19.05.2014 08:00 - 09:00 | 0 | 0 | 0 | 0 |
| 19.05.2014 09:00 - 10:00 | 0 | 0 | 0 | 0 |
| 19.05.2014 10:00 - 11:00 | 0 | 0 | 0 | 0 |
| 19.05.2014 11:00 - 12:00 | 0 | 0 | 0 | 0 |
| 19.05.2014 12:00 - 13:00 | 0 | 0 | 0 | 0 |
| 19.05.2014 13:00 - 14:00 | 0 | 0 | 0 | 0 |
| 19.05.2014 14:00 - 15:00 | 0 | 0 | 0 | 0 |
| 19.05.2014 15:00 - 16:00 | 0 | 0 | 0 | 0 |
| 19.05.2014 16:00 - 17:00 | 0 | 0 | 0 | 0 |
| 19.05.2014 17:00 - 18:00 | 0 | 0 | 0 | 0 |
| 19.05.2014 18:00 - 19:00 | 0 | 0 | 0 | 0 |
| 19.05.2014 19:00 - 20:00 | 0 | -50 | 0 | 0 |
| 19.05.2014 20:00 - 21:00 | 0 | -50 | 0 | 0 |
| 19.05.2014 21:00 - 22:00 | 0 | -50 | 0 | 0 |
| 19.05.2014 22:00 - 23:00 | 0 | -100 | 0 | 0 |
| 19.05.2014 23:00 - 24:00 | 0 | -100 | 0 | 0 |
| 20.05.2014 00:00 - 01:00 | 0 | -100 | 0 | 0 |
| 20.05.2014 01:00 - 02:00 | 0 | -100 | 0 | 0 |
| 20.05.2014 02:00 - 03:00 | 0 | -100 | 0 | 0 |
| 20.05.2014 03:00 - 04:00 | 0 | -100 | 0 | 0 |
| 20.05.2014 04:00 - 05:00 | 0 | -100 | 0 | 0 |
| 20.05.2014 05:00 - 06:00 | 0 | -100 | 0 | 0 |
| 20.05.2014 06:00 - 07:00 | 0 | 0 | 0 | 0 |
| 20.05.2014 07:00 - 08:00 | 0 | 0 | 0 | 0 |
| 20.05.2014 08:00 - 09:00 | 0 | 0 | 0 | 0 |
| 20.05.2014 09:00 - 10:00 | 0 | 0 | 0 | 0 |
| 20.05.2014 10:00 - 11:00 | 0 | 0 | 0 | 0 |
| 20.05.2014 11:00 - 12:00 | 0 | 0 | 0 | 0 |
| 20.05.2014 12:00 - 13:00 | 0 | 0 | 0 | 0 |
| 20.05.2014 13:00 - 14:00 | 0 | 0 | 0 | 0 |
| 20.05.2014 14:00 - 15:00 | 0 | 0 | 0 | 0 |
| 20.05.2014 15:00 - 16:00 | 0 | 0 | 0 | 0 |
| 20.05.2014 16:00 - 17:00 | 0 | 0 | 0 | 0 |
| 20.05.2014 17:00 - 18:00 | 0 | 0 | 0 | 0 |
| 20.05.2014 18:00 - 19:00 | 0 | 0 | 0 | 0 |
| 20.05.2014 19:00 - 20:00 | 0 | 0 | 0 | 0 |
| 20.05.2014 20:00 - 21:00 | 0 | 0 | 0 | 0 |
| 20.05.2014 21:00 - 22:00 | 0 | 0 | 0 | 0 |
| 20.05.2014 22:00 - 23:00 | 0 | -47 | 0 | 0 |
| 20.05.2014 23:00 - 24:00 | 0 | -47 | 0 | 0 |
| 21.05.2014 00:00 - 01:00 | 0 | -47 | 0 | 0 |
| 21.05.2014 01:00 - 02:00 | 0 | -47 | 0 | 0 |
| 21.05.2014 02:00 - 03:00 | 0 | -47 | 0 | 0 |
| 21.05.2014 03:00 - 04:00 | 0 | -47 | 0 | 0 |
| 21.05.2014 04:00 - 05:00 | 0 | -47 | 0 | 0 |
| 21.05.2014 05:00 - 06:00 | 0 | -47 | 0 | 0 |
| 21.05.2014 06:00 - 07:00 | 0 | 0 | 0 | 0 |
| 21.05.2014 07:00 - 08:00 | 0 | 0 | 0 | 0 |
| 21.05.2014 08:00 - 09:00 | 0 | 0 | 0 | 0 |
| 21.05.2014 09:00 - 10:00 | 0 | 0 | 0 | 0 |
| 21.05.2014 10:00 - 11:00 | 0 | 0 | 0 | 0 |
| 21.05.2014 11:00 - 12:00 | 0 | 0 | 0 | 0 |
| 21.05.2014 12:00 - 13:00 | 0 | 0 | 0 | 0 |
| 21.05.2014 13:00 - 14:00 | 0 | 0 | 0 | 0 |
| 21.05.2014 14:00 - 15:00 | 0 | 0 | 0 | 0 |
| 21.05.2014 15:00 - 16:00 | 0 | 0 | 0 | 0 |
| 21.05.2014 16:00 - 17:00 | 0 | 0 | 0 | 0 |
| 21.05.2014 17:00 - 18:00 | 0 | 0 | 0 | 0 |
| 21.05.2014 18:00 - 19:00 | 0 | 0 | 0 | 0 |
| 21.05.2014 19:00 - 20:00 | 0 | 0 | 0 | 0 |
| 21.05.2014 20:00 - 21:00 | 0 | 0 | 0 | 0 |
| 21.05.2014 21:00 - 22:00 | 0 | 0 | 0 | 0 |
| 21.05.2014 22:00 - 23:00 | 0 | 0 | 0 | 0 |
| 21.05.2014 23:00 - 24:00 | 0 | 0 | 0 | 0 |
| 22.05.2014 00:00 - 01:00 | 0 | 0 | 0 | 0 |
| 22.05.2014 01:00 - 02:00 | 0 | 0 | 0 | 0 |
| 22.05.2014 02:00 - 03:00 | 0 | -30 | 0 | 0 |
| 22.05.2014 03:00 - 04:00 | 0 | -30 | 0 | 0 |
| 22.05.2014 04:00 - 05:00 | 0 | -30 | 0 | 0 |
| 22.05.2014 05:00 - 06:00 | 0 | -30 | 0 | 0 |
| 22.05.2014 06:00 - 07:00 | 0 | 0 | 0 | 0 |
| 22.05.2014 07:00 - 08:00 | 0 | 0 | 0 | 0 |
| 22.05.2014 08:00 - 09:00 | 0 | 0 | 0 | 0 |
| 22.05.2014 09:00 - 10:00 | 0 | 0 | 0 | 0 |
| 22.05.2014 10:00 - 11:00 | 0 | 0 | 0 | 0 |
| 22.05.2014 11:00 - 12:00 | 0 | 0 | 0 | 0 |
| 22.05.2014 12:00 - 13:00 | 0 | 0 | 0 | 0 |
| 22.05.2014 13:00 - 14:00 | 0 | 0 | 0 | 0 |
| 22.05.2014 14:00 - 15:00 | 0 | 0 | 0 | 0 |
| 22.05.2014 15:00 - 16:00 | 0 | 0 | 0 | 0 |
| 22.05.2014 16:00 - 17:00 | 0 | 0 | 0 | 0 |
| 22.05.2014 17:00 - 18:00 | 0 | 0 | 0 | 0 |
| 22.05.2014 18:00 - 19:00 | 0 | 0 | 0 | 0 |
| 22.05.2014 19:00 - 20:00 | 0 | 0 | 0 | 0 |
| 22.05.2014 20:00 - 21:00 | 0 | 0 | 0 | 0 |
| 22.05.2014 21:00 - 22:00 | 0 | 0 | 0 | 0 |
| 22.05.2014 22:00 - 23:00 | 0 | 0 | 0 | 0 |
| 22.05.2014 23:00 - 24:00 | 0 | 0 | 0 | 0 |
| 23.05.2014 00:00 - 01:00 | 0 | 0 | 0 | 0 |
| 23.05.2014 01:00 - 02:00 | 0 | 0 | 0 | 0 |
| 23.05.2014 02:00 - 03:00 | 0 | 0 | 0 | 0 |
| 23.05.2014 03:00 - 04:00 | 0 | 0 | 0 | 0 |
| 23.05.2014 04:00 - 05:00 | 0 | 0 | 0 | 0 |
| 23.05.2014 05:00 - 06:00 | 0 | 0 | 0 | 0 |
| 23.05.2014 06:00 - 07:00 | 0 | 0 | 0 | 0 |
| 23.05.2014 07:00 - 08:00 | 0 | 0 | 0 | 0 |
| 23.05.2014 08:00 - 09:00 | 0 | 0 | 0 | 0 |
| 23.05.2014 09:00 - 10:00 | 0 | 0 | 0 | 0 |
| 23.05.2014 10:00 - 11:00 | 0 | 0 | 0 | 0 |
| 23.05.2014 11:00 - 12:00 | 0 | 0 | 0 | 0 |
| 23.05.2014 12:00 - 13:00 | 0 | 0 | 0 | 0 |
| 23.05.2014 13:00 - 14:00 | 0 | 0 | 0 | 0 |
| 23.05.2014 14:00 - 15:00 | 0 | 0 | 0 | 0 |
| 23.05.2014 15:00 - 16:00 | 0 | 0 | 0 | 0 |
| 23.05.2014 16:00 - 17:00 | 0 | 0 | 0 | 0 |
| 23.05.2014 17:00 - 18:00 | 0 | 0 | 0 | 0 |
| 23.05.2014 18:00 - 19:00 | 0 | 0 | 0 | 0 |
| 23.05.2014 19:00 - 20:00 | 0 | 0 | 0 | 0 |
| 23.05.2014 20:00 - 21:00 | 0 | 0 | 0 | 0 |
| 23.05.2014 21:00 - 22:00 | 0 | 0 | 0 | 0 |
| 23.05.2014 22:00 - 23:00 | 0 | 0 | 0 | 0 |
| 23.05.2014 23:00 - 24:00 | 0 | 0 | 0 | 0 |
| 24.05.2014 00:00 - 01:00 | 0 | 0 | 0 | 0 |
| 24.05.2014 01:00 - 02:00 | 0 | 0 | 0 | 0 |
| 24.05.2014 02:00 - 03:00 | 0 | 0 | 0 | 0 |
| 24.05.2014 03:00 - 04:00 | 0 | 0 | 0 | 0 |
| 24.05.2014 04:00 - 05:00 | 0 | 0 | 0 | 0 |
| 24.05.2014 05:00 - 06:00 | 0 | 0 | 0 | 0 |
| 24.05.2014 06:00 - 07:00 | 0 | 0 | 0 | 0 |
| 24.05.2014 07:00 - 08:00 | 0 | 0 | 0 | 0 |
| 24.05.2014 08:00 - 09:00 | 0 | 0 | 0 | 0 |
| 24.05.2014 09:00 - 10:00 | 0 | 0 | 0 | 0 |
| 24.05.2014 10:00 - 11:00 | 0 | 0 | 0 | 0 |
| 24.05.2014 11:00 - 12:00 | 0 | 0 | 0 | 0 |
| 24.05.2014 12:00 - 13:00 | 0 | 0 | 0 | 0 |
| 24.05.2014 13:00 - 14:00 | 0 | 0 | 0 | 0 |
| 24.05.2014 14:00 - 15:00 | 0 | 0 | 0 | 0 |
| 24.05.2014 15:00 - 16:00 | 0 | 0 | 0 | 0 |
| 24.05.2014 16:00 - 17:00 | 0 | 0 | 0 | 0 |
| 24.05.2014 17:00 - 18:00 | 0 | 0 | 0 | 0 |
| 24.05.2014 18:00 - 19:00 | 0 | 0 | 0 | 0 |
| 24.05.2014 19:00 - 20:00 | 0 | 0 | 0 | 0 |
| 24.05.2014 20:00 - 21:00 | 0 | 0 | 0 | 0 |
| 24.05.2014 21:00 - 22:00 | 0 | 0 | 0 | 0 |
| 24.05.2014 22:00 - 23:00 | 0 | 0 | 0 | 0 |
| 24.05.2014 23:00 - 24:00 | 0 | 0 | 0 | 0 |
| 25.05.2014 00:00 - 01:00 | 0 | 0 | 0 | 0 |
| 25.05.2014 01:00 - 02:00 | 0 | 0 | 0 | 0 |
| 25.05.2014 02:00 - 03:00 | 0 | 0 | 0 | 0 |
| 25.05.2014 03:00 - 04:00 | 0 | 0 | 0 | 0 |
| 25.05.2014 04:00 - 05:00 | 0 | 0 | 0 | 0 |
| 25.05.2014 05:00 - 06:00 | 0 | 0 | 0 | 0 |
| 25.05.2014 06:00 - 07:00 | 0 | 0 | 0 | 0 |
| 25.05.2014 07:00 - 08:00 | 0 | 0 | 0 | 0 |
| 25.05.2014 08:00 - 09:00 | 0 | 0 | 0 | 0 |
| 25.05.2014 09:00 - 10:00 | 0 | 0 | 0 | 0 |
| 25.05.2014 10:00 - 11:00 | 0 | 0 | 0 | 0 |
| 25.05.2014 11:00 - 12:00 | 0 | 0 | 0 | 0 |
| 25.05.2014 12:00 - 13:00 | 0 | 0 | 0 | 0 |
| 25.05.2014 13:00 - 14:00 | 0 | 0 | 0 | 0 |
| 25.05.2014 14:00 - 15:00 | 0 | 0 | 0 | 0 |
| 25.05.2014 15:00 - 16:00 | 0 | 0 | 0 | 0 |
| 25.05.2014 16:00 - 17:00 | 0 | 0 | 0 | 0 |
| 25.05.2014 17:00 - 18:00 | 0 | 0 | 0 | 0 |
| 25.05.2014 18:00 - 19:00 | 0 | -60 | 0 | 0 |
| 25.05.2014 19:00 - 20:00 | 0 | -60 | 0 | 0 |
| 25.05.2014 20:00 - 21:00 | 0 | -60 | 0 | 0 |
| 25.05.2014 21:00 - 22:00 | 0 | -60 | 0 | 0 |
| 25.05.2014 22:00 - 23:00 | 0 | -60 | 0 | 0 |
| 25.05.2014 23:00 - 24:00 | 0 | -60 | 0 | 0 |
| 26.05.2014 00:00 - 01:00 | 0 | -60 | 0 | 0 |
| 26.05.2014 01:00 - 02:00 | 0 | -60 | 0 | 0 |
| 26.05.2014 02:00 - 03:00 | 0 | -60 | 0 | 0 |
| 26.05.2014 03:00 - 04:00 | 0 | -60 | 0 | 0 |
| 26.05.2014 04:00 - 05:00 | 0 | -60 | 0 | 0 |
| 26.05.2014 05:00 - 06:00 | 0 | -60 | 0 | 0 |
| 26.05.2014 06:00 - 07:00 | 0 | 0 | 0 | 0 |
| 26.05.2014 07:00 - 08:00 | 0 | 0 | 0 | 0 |
| 26.05.2014 08:00 - 09:00 | 0 | 0 | 0 | 0 |
| 26.05.2014 09:00 - 10:00 | 0 | 0 | 0 | 0 |
| 26.05.2014 10:00 - 11:00 | 0 | 0 | 0 | 0 |
| 26.05.2014 11:00 - 12:00 | 0 | 0 | 0 | 0 |
| 26.05.2014 12:00 - 13:00 | 0 | 0 | 0 | 0 |
| 26.05.2014 13:00 - 14:00 | 0 | 0 | 0 | 0 |
| 26.05.2014 14:00 - 15:00 | 0 | 0 | 0 | 0 |
| 26.05.2014 15:00 - 16:00 | 0 | 0 | 0 | 0 |
| 26.05.2014 16:00 - 17:00 | 0 | 0 | 0 | 0 |
| 26.05.2014 17:00 - 18:00 | 0 | 0 | 0 | 0 |
| 26.05.2014 18:00 - 19:00 | 0 | 0 | 0 | 0 |
| 26.05.2014 19:00 - 20:00 | 0 | 0 | 0 | 0 |
| 26.05.2014 20:00 - 21:00 | 0 | 0 | 0 | 0 |
| 26.05.2014 21:00 - 22:00 | 0 | 0 | 0 | 0 |
| 26.05.2014 22:00 - 23:00 | 0 | 0 | 0 | 0 |
| 26.05.2014 23:00 - 24:00 | 0 | 0 | 0 | 0 |
| 27.05.2014 00:00 - 01:00 | 0 | 0 | 0 | 0 |
| 27.05.2014 01:00 - 02:00 | 0 | 0 | 0 | 0 |
| 27.05.2014 02:00 - 03:00 | 0 | 0 | 0 | 0 |
| 27.05.2014 03:00 - 04:00 | 0 | 0 | 0 | 0 |
| 27.05.2014 04:00 - 05:00 | 0 | 0 | 0 | 0 |
| 27.05.2014 05:00 - 06:00 | 0 | 0 | 0 | 0 |
| 27.05.2014 06:00 - 07:00 | 0 | 0 | 0 | 0 |
| 27.05.2014 07:00 - 08:00 | 0 | 0 | 0 | 0 |
| 27.05.2014 08:00 - 09:00 | 0 | 0 | 0 | 0 |
| 27.05.2014 09:00 - 10:00 | 0 | 0 | 0 | 0 |
| 27.05.2014 10:00 - 11:00 | 0 | 0 | 0 | 0 |
| 27.05.2014 11:00 - 12:00 | 0 | 0 | 0 | 0 |
| 27.05.2014 12:00 - 13:00 | 0 | 0 | 0 | 0 |
| 27.05.2014 13:00 - 14:00 | 0 | 0 | 0 | 0 |
| 27.05.2014 14:00 - 15:00 | 0 | 0 | 0 | 0 |
| 27.05.2014 15:00 - 16:00 | 0 | 0 | 0 | 0 |
| 27.05.2014 16:00 - 17:00 | 0 | 0 | 0 | 0 |
| 27.05.2014 17:00 - 18:00 | 0 | 0 | 0 | 0 |
| 27.05.2014 18:00 - 19:00 | 0 | 0 | 0 | 0 |
| 27.05.2014 19:00 - 20:00 | 0 | 0 | 0 | 0 |
| 27.05.2014 20:00 - 21:00 | 0 | 0 | 0 | 0 |
| 27.05.2014 21:00 - 22:00 | 0 | 0 | 0 | 0 |
| 27.05.2014 22:00 - 23:00 | 0 | 0 | 0 | 0 |
| 27.05.2014 23:00 - 24:00 | 0 | 0 | 0 | 0 |
| 28.05.2014 00:00 - 01:00 | 0 | 0 | 0 | 0 |
| 28.05.2014 01:00 - 02:00 | 0 | 0 | 0 | 0 |
| 28.05.2014 02:00 - 03:00 | 0 | 0 | 0 | 0 |
| 28.05.2014 03:00 - 04:00 | 0 | 0 | 0 | 0 |
| 28.05.2014 04:00 - 05:00 | 0 | 0 | 0 | 0 |
| 28.05.2014 05:00 - 06:00 | 0 | 0 | 0 | 0 |
| 28.05.2014 06:00 - 07:00 | 0 | 0 | 0 | 0 |
| 28.05.2014 07:00 - 08:00 | 0 | 0 | 0 | 0 |
| 28.05.2014 08:00 - 09:00 | 0 | 0 | 0 | 0 |
| 28.05.2014 09:00 - 10:00 | 0 | 0 | 0 | 0 |
| 28.05.2014 10:00 - 11:00 | 0 | 0 | 0 | 0 |
| 28.05.2014 11:00 - 12:00 | 0 | 0 | 0 | 0 |
| 28.05.2014 12:00 - 13:00 | 0 | 0 | 0 | 0 |
| 28.05.2014 13:00 - 14:00 | 0 | 0 | 0 | 0 |
| 28.05.2014 14:00 - 15:00 | 0 | 0 | 0 | 0 |
| 28.05.2014 15:00 - 16:00 | 0 | 0 | 0 | 0 |
| 28.05.2014 16:00 - 17:00 | 0 | 0 | 0 | 0 |
| 28.05.2014 17:00 - 18:00 | 0 | 0 | 0 | 0 |
| 28.05.2014 18:00 - 19:00 | 0 | 0 | 0 | 0 |
| 28.05.2014 19:00 - 20:00 | 0 | 0 | 0 | 0 |
| 28.05.2014 20:00 - 21:00 | 0 | 0 | 0 | 0 |
| 28.05.2014 21:00 - 22:00 | 0 | 0 | 0 | 0 |
| 28.05.2014 22:00 - 23:00 | 0 | 0 | 0 | 0 |
| 28.05.2014 23:00 - 24:00 | 0 | 0 | 0 | 0 |
| 29.05.2014 00:00 - 01:00 | 0 | 0 | 0 | 0 |
| 29.05.2014 01:00 - 02:00 | 0 | 0 | 0 | 0 |
| 29.05.2014 02:00 - 03:00 | 0 | 0 | 0 | 0 |
| 29.05.2014 03:00 - 04:00 | 0 | 0 | 0 | 0 |
| 29.05.2014 04:00 - 05:00 | 0 | 0 | 0 | 0 |
| 29.05.2014 05:00 - 06:00 | 0 | 0 | 0 | 0 |
| 29.05.2014 06:00 - 07:00 | 0 | 0 | 0 | 0 |
| 29.05.2014 07:00 - 08:00 | 0 | 0 | 0 | 0 |
| 29.05.2014 08:00 - 09:00 | 0 | 0 | 0 | 0 |
| 29.05.2014 09:00 - 10:00 | 0 | 0 | 0 | 0 |
| 29.05.2014 10:00 - 11:00 | 0 | 0 | 0 | 0 |
| 29.05.2014 11:00 - 12:00 | 0 | 0 | 0 | 0 |
| 29.05.2014 12:00 - 13:00 | 0 | 0 | 0 | 0 |
| 29.05.2014 13:00 - 14:00 | 0 | 0 | 0 | 0 |
| 29.05.2014 14:00 - 15:00 | 0 | 0 | 0 | 0 |
| 29.05.2014 15:00 - 16:00 | 0 | 0 | 0 | 0 |
| 29.05.2014 16:00 - 17:00 | 0 | 0 | 0 | 0 |
| 29.05.2014 17:00 - 18:00 | 0 | 0 | 0 | 0 |
| 29.05.2014 18:00 - 19:00 | 0 | 0 | 0 | 0 |
| 29.05.2014 19:00 - 20:00 | 0 | 0 | 0 | 0 |
| 29.05.2014 20:00 - 21:00 | 0 | 0 | 0 | 0 |
| 29.05.2014 21:00 - 22:00 | 0 | 0 | 0 | 0 |
| 29.05.2014 22:00 - 23:00 | 0 | 0 | 0 | 0 |
| 29.05.2014 23:00 - 24:00 | 0 | 0 | 0 | 0 |
| 30.05.2014 00:00 - 01:00 | 80 | 0 | 0 | 0 |
| 30.05.2014 01:00 - 02:00 | 80 | 0 | 0 | 0 |
| 30.05.2014 02:00 - 03:00 | 80 | 0 | 0 | 0 |
| 30.05.2014 03:00 - 04:00 | 80 | 0 | 0 | 0 |
| 30.05.2014 04:00 - 05:00 | 80 | 0 | 0 | 0 |
| 30.05.2014 05:00 - 06:00 | 80 | 0 | 0 | 0 |
| 30.05.2014 06:00 - 07:00 | 0 | 0 | 0 | 0 |
| 30.05.2014 07:00 - 08:00 | 0 | 0 | 0 | 0 |
| 30.05.2014 08:00 - 09:00 | 0 | 0 | 0 | 0 |
| 30.05.2014 09:00 - 10:00 | 0 | 0 | 0 | 0 |
| 30.05.2014 10:00 - 11:00 | 0 | 0 | 0 | 0 |
| 30.05.2014 11:00 - 12:00 | 0 | 0 | 0 | 0 |
| 30.05.2014 12:00 - 13:00 | 0 | 0 | 0 | 0 |
| 30.05.2014 13:00 - 14:00 | 0 | 0 | 0 | 0 |
| 30.05.2014 14:00 - 15:00 | 0 | 0 | 0 | 0 |
| 30.05.2014 15:00 - 16:00 | 0 | 0 | 0 | 0 |
| 30.05.2014 16:00 - 17:00 | 0 | 0 | 0 | 0 |
| 30.05.2014 17:00 - 18:00 | 0 | 0 | 0 | 0 |
| 30.05.2014 18:00 - 19:00 | 0 | 0 | 0 | 0 |
| 30.05.2014 19:00 - 20:00 | 0 | 0 | 0 | 0 |
| 30.05.2014 20:00 - 21:00 | 0 | 0 | 0 | 0 |
| 30.05.2014 21:00 - 22:00 | 0 | 0 | 0 | 0 |
| 30.05.2014 22:00 - 23:00 | 0 | 0 | 0 | 0 |
| 30.05.2014 23:00 - 24:00 | 0 | 0 | 0 | 0 |
| 31.05.2014 00:00 - 01:00 | 0 | 0 | 0 | 0 |
| 31.05.2014 01:00 - 02:00 | 0 | 0 | 0 | 0 |
| 31.05.2014 02:00 - 03:00 | 120 | 0 | 0 | 0 |
| 31.05.2014 03:00 - 04:00 | 120 | 0 | 0 | 0 |